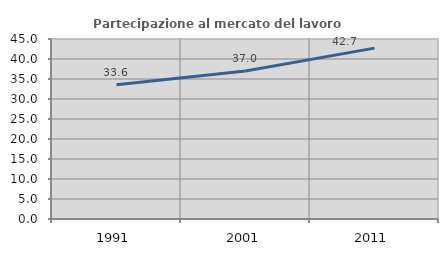
| Category | Partecipazione al mercato del lavoro  femminile |
|---|---|
| 1991.0 | 33.57 |
| 2001.0 | 37.006 |
| 2011.0 | 42.716 |